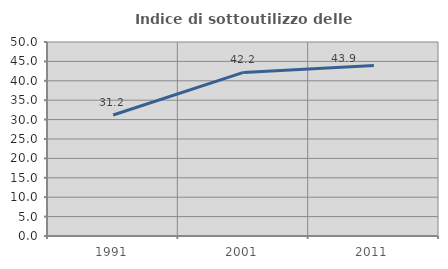
| Category | Indice di sottoutilizzo delle abitazioni  |
|---|---|
| 1991.0 | 31.189 |
| 2001.0 | 42.161 |
| 2011.0 | 43.941 |